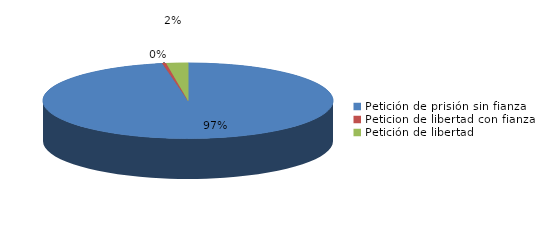
| Category | Series 0 |
|---|---|
| Petición de prisión sin fianza | 649 |
| Peticion de libertad con fianza | 3 |
| Petición de libertad | 16 |